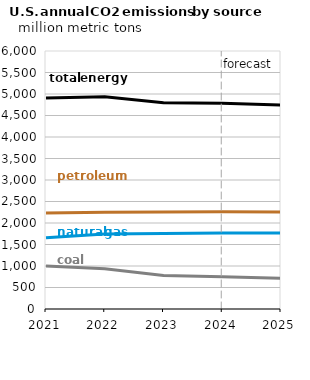
| Category | Liquid biofuels | Total energy | Natural gas | Coal |
|---|---|---|---|---|
| 2021.0 | 2234.823 | 4905.622 | 1656.12 | 1002.651 |
| 2022.0 | 2250.258 | 4938.513 | 1742.143 | 938.649 |
| 2023.0 | 2253.019 | 4793.93 | 1755.803 | 777.646 |
| 2024.0 | 2260.478 | 4783.002 | 1767.608 | 747.455 |
| 2025.0 | 2256.709 | 4743.142 | 1767.094 | 711.879 |